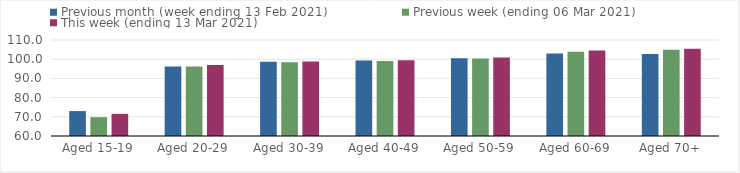
| Category | Previous month (week ending 13 Feb 2021) | Previous week (ending 06 Mar 2021) | This week (ending 13 Mar 2021) |
|---|---|---|---|
| Aged 15-19 | 72.98 | 69.8 | 71.54 |
| Aged 20-29 | 96.18 | 96.18 | 97.02 |
| Aged 30-39 | 98.68 | 98.37 | 98.78 |
| Aged 40-49 | 99.37 | 99.05 | 99.5 |
| Aged 50-59 | 100.47 | 100.36 | 100.9 |
| Aged 60-69 | 103.01 | 103.91 | 104.53 |
| Aged 70+ | 102.77 | 104.88 | 105.42 |